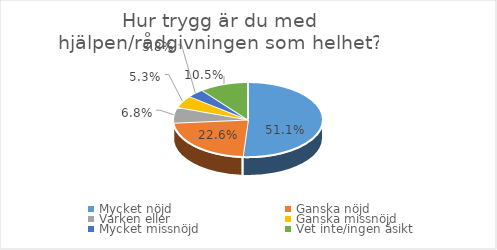
| Category | Series 0 |
|---|---|
| Mycket nöjd  | 0.511 |
| Ganska nöjd | 0.226 |
| Varken eller  | 0.068 |
| Ganska missnöjd | 0.053 |
| Mycket missnöjd  | 0.038 |
| Vet inte/ingen åsikt | 0.105 |